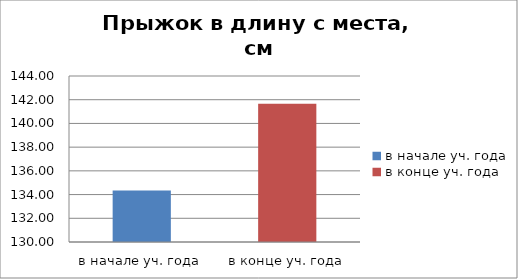
| Category | Series 0 |
|---|---|
| в начале уч. года | 134.333 |
| в конце уч. года | 141.667 |